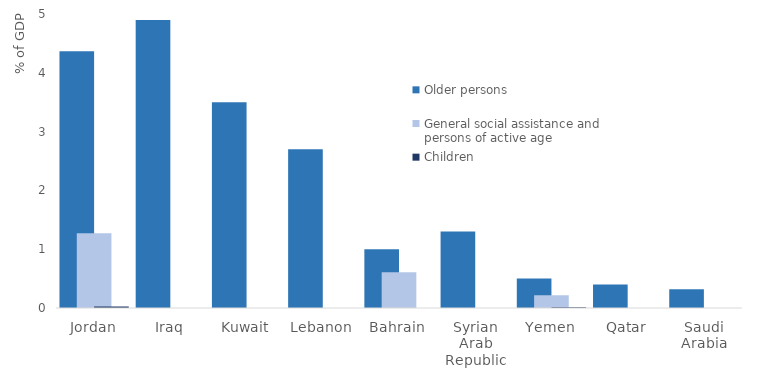
| Category | Older persons | General social assistance and persons of active age | Children |
|---|---|---|---|
| Jordan | 4.366 | 1.271 | 0.024 |
| Iraq | 4.9 | 0 | 0 |
| Kuwait | 3.5 | 0 | 0 |
| Lebanon | 2.7 | 0 | 0 |
| Bahrain | 1 | 0.61 | 0 |
| Syrian Arab Republic | 1.3 | 0 | 0 |
| Yemen | 0.5 | 0.218 | 0.012 |
| Qatar | 0.4 | 0 | 0 |
| Saudi Arabia | 0.32 | 0 | 0 |